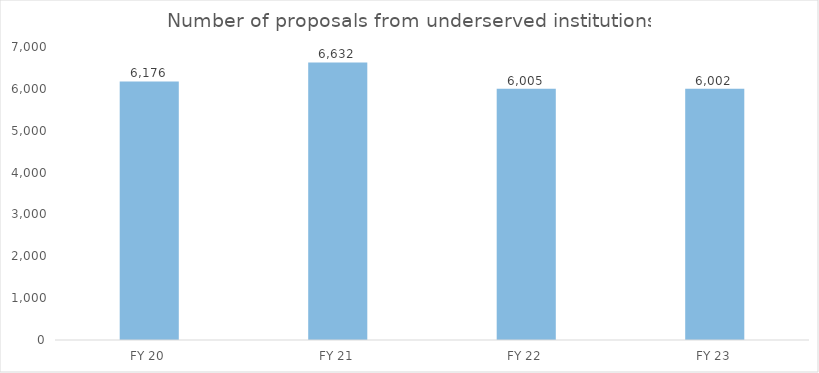
| Category | Series 1 |
|---|---|
| FY 20 | 6176 |
| FY 21 | 6632 |
| FY 22 | 6005 |
| FY 23 | 6002 |